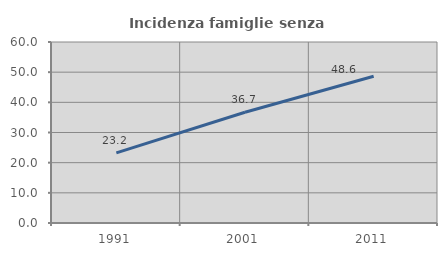
| Category | Incidenza famiglie senza nuclei |
|---|---|
| 1991.0 | 23.226 |
| 2001.0 | 36.702 |
| 2011.0 | 48.649 |